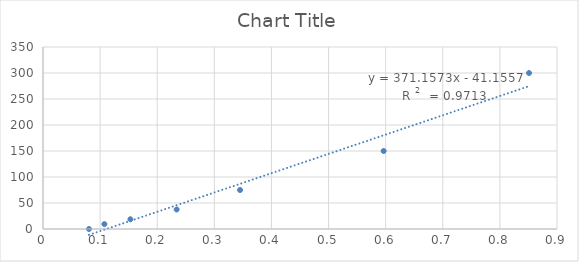
| Category | Series 0 |
|---|---|
| 0.851 | 300 |
| 0.5965 | 150 |
| 0.345 | 75 |
| 0.234 | 37.5 |
| 0.153 | 18.75 |
| 0.1075 | 9.375 |
| 0.0805 | 0 |